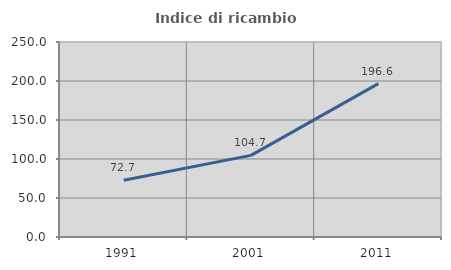
| Category | Indice di ricambio occupazionale  |
|---|---|
| 1991.0 | 72.727 |
| 2001.0 | 104.673 |
| 2011.0 | 196.562 |